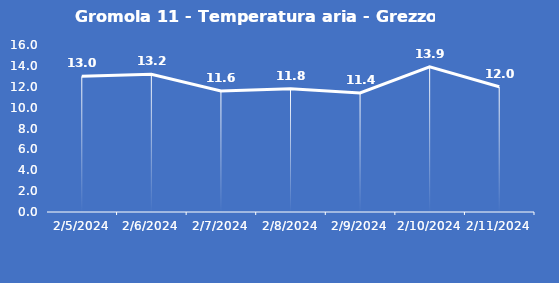
| Category | Gromola 11 - Temperatura aria - Grezzo (°C) |
|---|---|
| 2/5/24 | 13 |
| 2/6/24 | 13.2 |
| 2/7/24 | 11.6 |
| 2/8/24 | 11.8 |
| 2/9/24 | 11.4 |
| 2/10/24 | 13.9 |
| 2/11/24 | 12 |